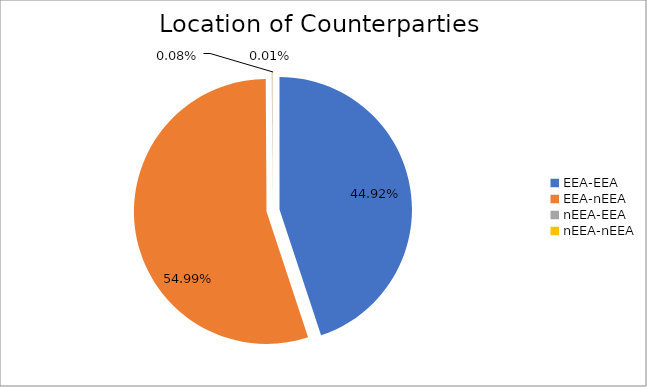
| Category | Series 0 |
|---|---|
| EEA-EEA | 6069938.238 |
| EEA-nEEA | 7430223.588 |
| nEEA-EEA | 10411.728 |
| nEEA-nEEA | 1974.974 |